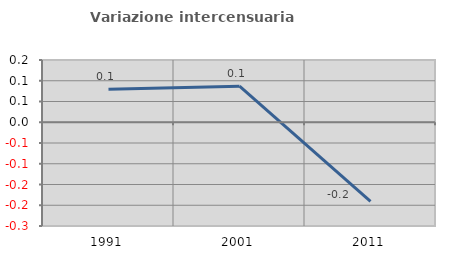
| Category | Variazione intercensuaria annua |
|---|---|
| 1991.0 | 0.079 |
| 2001.0 | 0.087 |
| 2011.0 | -0.191 |